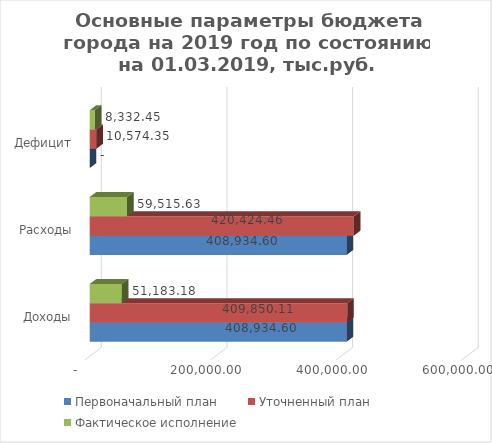
| Category | Первоначальный план | Уточненный план | Фактическое исполнение |
|---|---|---|---|
| Доходы | 408934.598 | 409850.113 | 51183.179 |
| Расходы | 408934.598 | 420424.461 | 59515.633 |
| Дефицит | 0 | 10574.348 | 8332.454 |